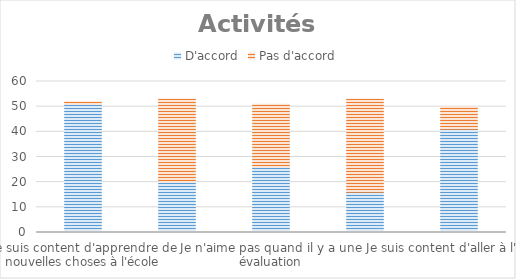
| Category | D'accord | Pas d'accord |
|---|---|---|
| Je suis content d'apprendre de nouvelles choses à l'école | 51 | 1 |
| J'ai trop de devoirs à faire à la maison | 20 | 33 |
| Je n'aime pas quand il y a une évaluation | 26 | 25 |
| Je travaille trop à l'école | 16 | 37 |
| Je suis content d'aller à l'école | 41 | 9 |